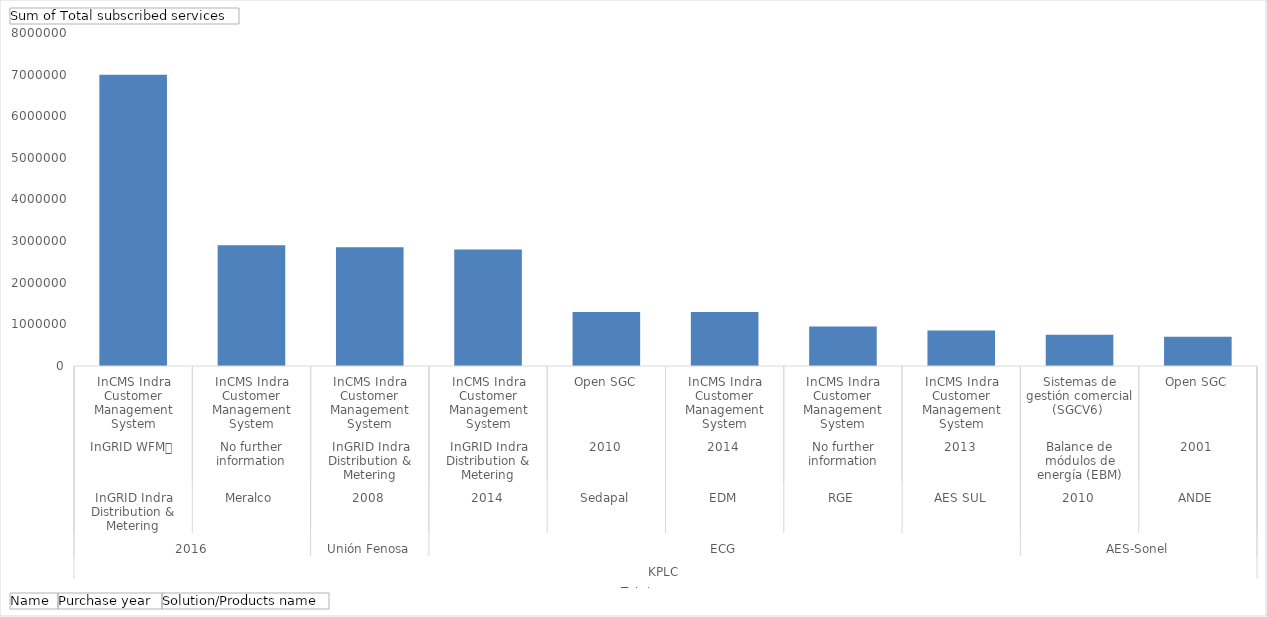
| Category | Total |
|---|---|
| 0 | 7000000 |
| 1 | 2900000 |
| 2 | 2850000 |
| 3 | 2800000 |
| 4 | 1300000 |
| 5 | 1300000 |
| 6 | 950000 |
| 7 | 850000 |
| 8 | 750000 |
| 9 | 700000 |